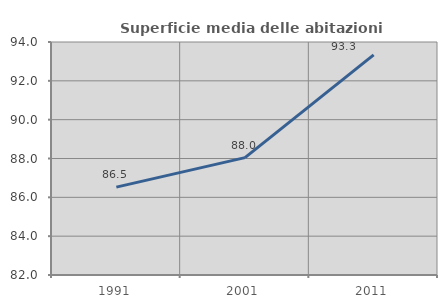
| Category | Superficie media delle abitazioni occupate |
|---|---|
| 1991.0 | 86.525 |
| 2001.0 | 88.047 |
| 2011.0 | 93.335 |